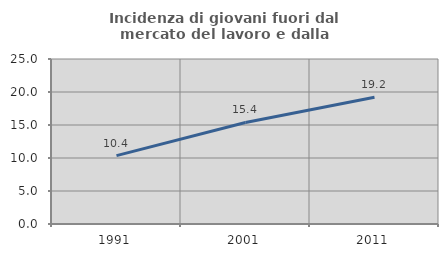
| Category | Incidenza di giovani fuori dal mercato del lavoro e dalla formazione  |
|---|---|
| 1991.0 | 10.363 |
| 2001.0 | 15.385 |
| 2011.0 | 19.209 |